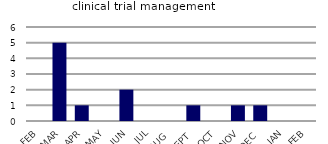
| Category | clinical trial management |
|---|---|
| FEB | 0 |
| MAR | 5 |
| APR | 1 |
| MAY | 0 |
| JUN | 2 |
| JUL | 0 |
| AUG | 0 |
| SEPT | 1 |
| OCT | 0 |
| NOV | 1 |
| DEC | 1 |
| JAN | 0 |
| FEB | 0 |